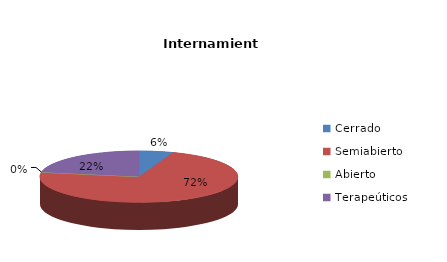
| Category | Series 0 |
|---|---|
| Cerrado | 1 |
| Semiabierto | 13 |
| Abierto | 0 |
| Terapeúticos | 4 |